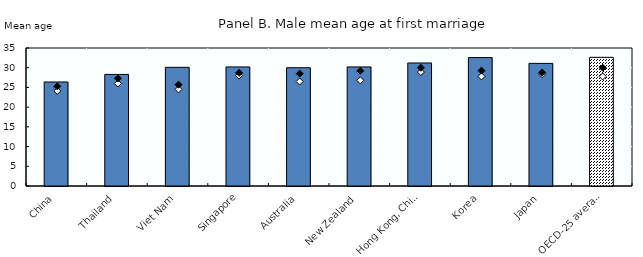
| Category | 2015 |
|---|---|
| China | 26.38 |
| Thailand | 28.3 |
| Viet Nam | 30.1 |
| Singapore | 30.2 |
| Australia | 30 |
| New Zealand | 30.2 |
| Hong Kong, China | 31.2 |
| Korea | 32.57 |
| Japan | 31.1 |
| OECD-25 average (e) | 32.637 |